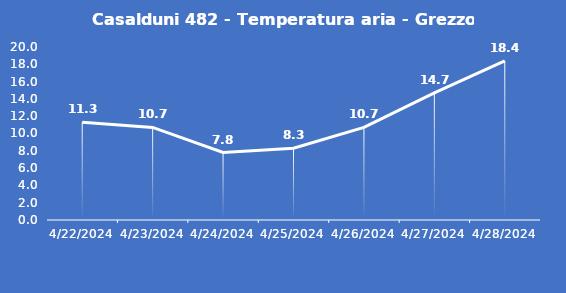
| Category | Casalduni 482 - Temperatura aria - Grezzo (°C) |
|---|---|
| 4/22/24 | 11.3 |
| 4/23/24 | 10.7 |
| 4/24/24 | 7.8 |
| 4/25/24 | 8.3 |
| 4/26/24 | 10.7 |
| 4/27/24 | 14.7 |
| 4/28/24 | 18.4 |